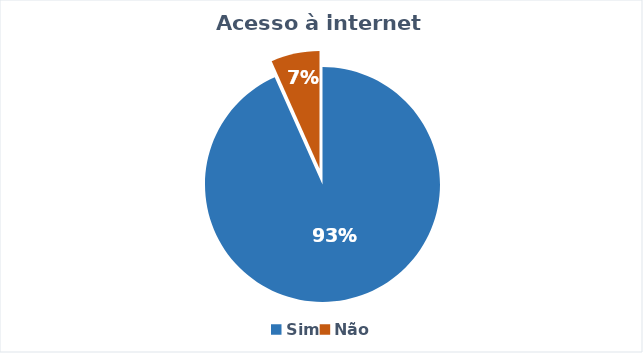
| Category | Series 0 |
|---|---|
| Sim | 42 |
| Não | 3 |